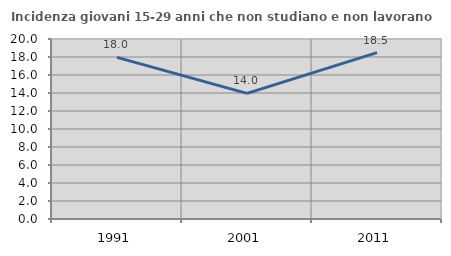
| Category | Incidenza giovani 15-29 anni che non studiano e non lavorano  |
|---|---|
| 1991.0 | 17.956 |
| 2001.0 | 13.953 |
| 2011.0 | 18.487 |